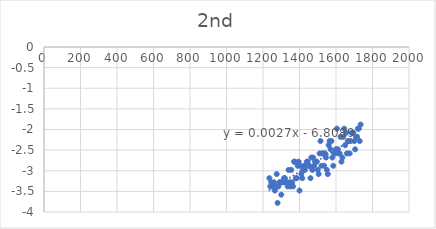
| Category | Series 0 |
|---|---|
| 1235.0 | -3.18 |
| 1240.0 | -3.38 |
| 1245.0 | -3.28 |
| 1250.0 | -3.38 |
| 1255.0 | -3.38 |
| 1260.0 | -3.28 |
| 1265.0 | -3.48 |
| 1270.0 | -3.38 |
| 1275.0 | -3.08 |
| 1280.0 | -3.78 |
| 1285.0 | -3.38 |
| 1290.0 | -3.28 |
| 1295.0 | -3.28 |
| 1300.0 | -3.58 |
| 1305.0 | -3.28 |
| 1310.0 | -3.28 |
| 1315.0 | -3.18 |
| 1320.0 | -3.18 |
| 1325.0 | -3.28 |
| 1330.0 | -3.28 |
| 1335.0 | -3.38 |
| 1340.0 | -2.98 |
| 1345.0 | -3.28 |
| 1350.0 | -3.38 |
| 1355.0 | -2.98 |
| 1360.0 | -3.28 |
| 1365.0 | -3.38 |
| 1370.0 | -2.78 |
| 1375.0 | -2.78 |
| 1380.0 | -3.18 |
| 1385.0 | -3.18 |
| 1390.0 | -2.88 |
| 1395.0 | -2.78 |
| 1400.0 | -3.48 |
| 1405.0 | -2.88 |
| 1410.0 | -3.08 |
| 1415.0 | -3.18 |
| 1420.0 | -2.98 |
| 1425.0 | -2.88 |
| 1430.0 | -2.98 |
| 1435.0 | -2.88 |
| 1440.0 | -2.78 |
| 1445.0 | -2.78 |
| 1450.0 | -2.88 |
| 1455.0 | -2.88 |
| 1460.0 | -3.18 |
| 1465.0 | -2.68 |
| 1470.0 | -2.98 |
| 1475.0 | -2.68 |
| 1480.0 | -2.88 |
| 1485.0 | -2.78 |
| 1490.0 | -2.78 |
| 1495.0 | -2.78 |
| 1500.0 | -2.98 |
| 1505.0 | -3.08 |
| 1510.0 | -2.58 |
| 1515.0 | -2.28 |
| 1520.0 | -2.88 |
| 1525.0 | -2.58 |
| 1530.0 | -2.58 |
| 1535.0 | -2.88 |
| 1540.0 | -2.58 |
| 1545.0 | -2.68 |
| 1550.0 | -2.98 |
| 1555.0 | -3.08 |
| 1560.0 | -2.38 |
| 1565.0 | -2.28 |
| 1570.0 | -2.48 |
| 1575.0 | -2.28 |
| 1580.0 | -2.68 |
| 1585.0 | -2.88 |
| 1590.0 | -2.58 |
| 1595.0 | -2.58 |
| 1600.0 | -2.48 |
| 1605.0 | -1.98 |
| 1610.0 | -2.48 |
| 1615.0 | -2.58 |
| 1620.0 | -2.58 |
| 1625.0 | -2.18 |
| 1630.0 | -2.78 |
| 1635.0 | -2.68 |
| 1640.0 | -2.18 |
| 1645.0 | -1.98 |
| 1650.0 | -2.38 |
| 1655.0 | -2.08 |
| 1660.0 | -2.58 |
| 1665.0 | -2.28 |
| 1670.0 | -2.28 |
| 1675.0 | -2.58 |
| 1680.0 | -2.28 |
| 1685.0 | -2.08 |
| 1690.0 | -2.08 |
| 1695.0 | -2.08 |
| 1700.0 | -2.28 |
| 1705.0 | -2.48 |
| 1710.0 | -2.18 |
| 1715.0 | -2.18 |
| 1720.0 | -1.98 |
| 1725.0 | -1.98 |
| 1730.0 | -2.28 |
| 1735.0 | -1.88 |